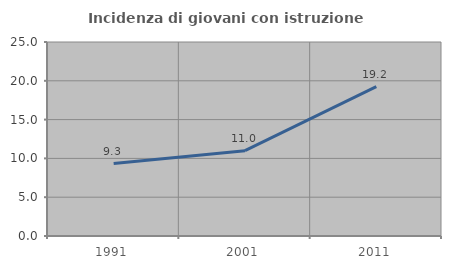
| Category | Incidenza di giovani con istruzione universitaria |
|---|---|
| 1991.0 | 9.337 |
| 2001.0 | 10.993 |
| 2011.0 | 19.247 |